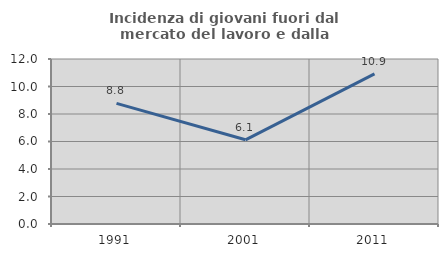
| Category | Incidenza di giovani fuori dal mercato del lavoro e dalla formazione  |
|---|---|
| 1991.0 | 8.772 |
| 2001.0 | 6.122 |
| 2011.0 | 10.924 |